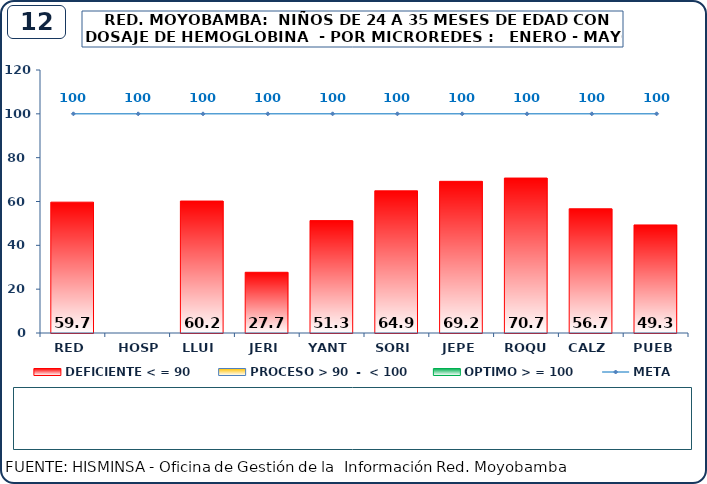
| Category | DEFICIENTE < = 90 | PROCESO > 90  -  < 100 | OPTIMO > = 100 |
|---|---|---|---|
| RED | 59.7 | 0 | 0 |
| HOSP | 0 | 0 | 0 |
| LLUI | 60.2 | 0 | 0 |
| JERI | 27.7 | 0 | 0 |
| YANT | 51.3 | 0 | 0 |
| SORI | 64.9 | 0 | 0 |
| JEPE | 69.2 | 0 | 0 |
| ROQU | 70.7 | 0 | 0 |
| CALZ | 56.7 | 0 | 0 |
| PUEB | 49.3 | 0 | 0 |